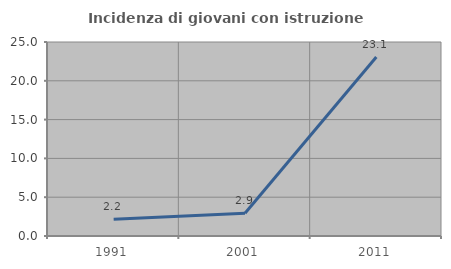
| Category | Incidenza di giovani con istruzione universitaria |
|---|---|
| 1991.0 | 2.174 |
| 2001.0 | 2.941 |
| 2011.0 | 23.077 |